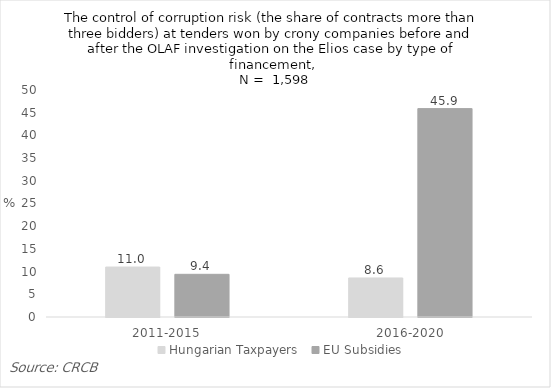
| Category | Hungarian Taxpayers | EU Subsidies |
|---|---|---|
| 2011-2015 | 11 | 9.4 |
| 2016-2020 | 8.6 | 45.9 |